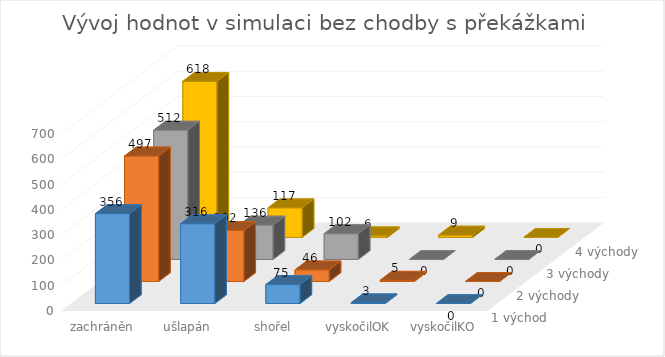
| Category | 1 východ | 2 východy | 3 východy | 4 východy |
|---|---|---|---|---|
| zachráněn | 356 | 497 | 512 | 618 |
| ušlapán | 316 | 202 | 136 | 117 |
| shořel | 75 | 46 | 102 | 6 |
| vyskočilOK | 3 | 5 | 0 | 9 |
| vyskočilKO | 0 | 0 | 0 | 0 |